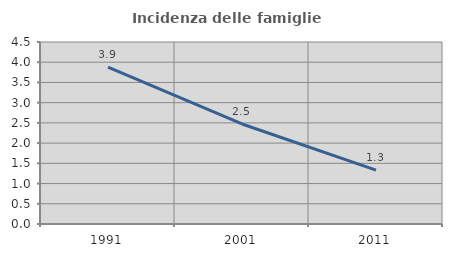
| Category | Incidenza delle famiglie numerose |
|---|---|
| 1991.0 | 3.88 |
| 2001.0 | 2.473 |
| 2011.0 | 1.331 |